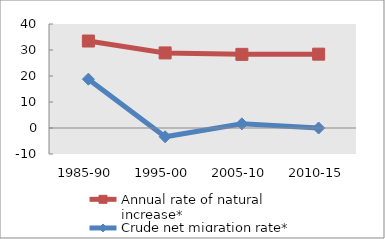
| Category | Annual rate of natural increase* | Crude net migration rate* |
|---|---|---|
| 1985-90 | 33.452 | 18.789 |
| 1995-00 | 28.875 | -3.365 |
| 2005-10 | 28.32 | 1.588 |
| 2010-15 | 28.401 | 0 |